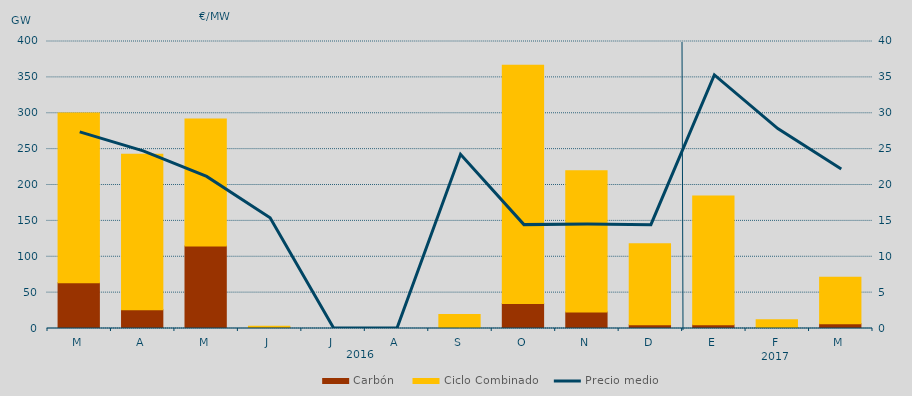
| Category | Carbón | Ciclo Combinado |
|---|---|---|
| M | 63887.5 | 236337.4 |
| A | 26224.4 | 216603.9 |
| M | 115140.8 | 176958.3 |
| J | 1863 | 1250.7 |
| J | 0 | 0 |
| A | 0 | 0 |
| S | 0 | 19356.8 |
| O | 34726.1 | 332294.3 |
| N | 23135.1 | 196729.3 |
| D | 5215.5 | 112859.3 |
| E | 5325.4 | 179227.5 |
| F | 1383.6 | 10714 |
| M | 6612.9 | 64802.4 |